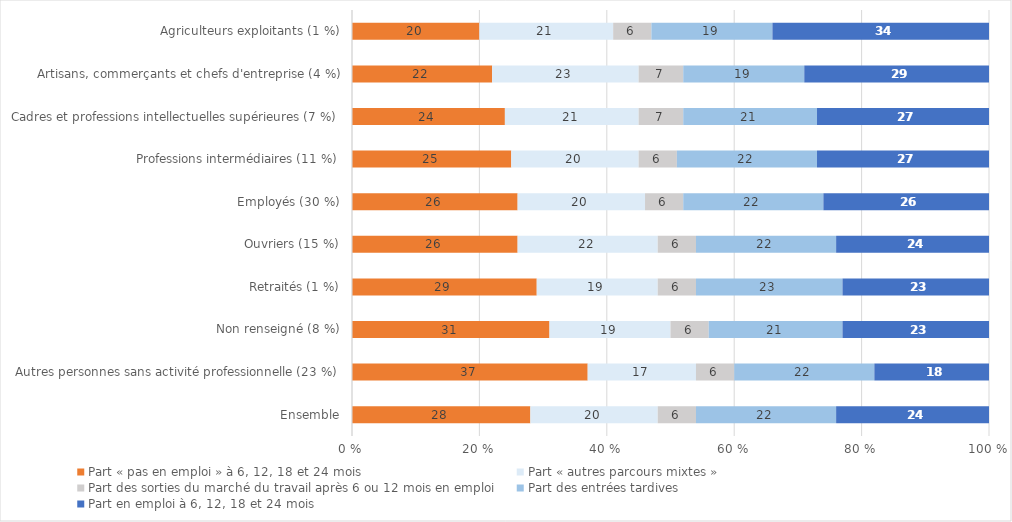
| Category | Part « pas en emploi » à 6, 12, 18 et 24 mois | Part « autres parcours mixtes » | Part des sorties du marché du travail après 6 ou 12 mois en emploi | Part des entrées tardives | Part en emploi à 6, 12, 18 et 24 mois |
|---|---|---|---|---|---|
| Ensemble | 28 | 20 | 6 | 22 | 24 |
| Autres personnes sans activité professionnelle (23 %) | 37 | 17 | 6 | 22 | 18 |
| Non renseigné (8 %) | 31 | 19 | 6 | 21 | 23 |
| Retraités (1 %) | 29 | 19 | 6 | 23 | 23 |
| Ouvriers (15 %) | 26 | 22 | 6 | 22 | 24 |
| Employés (30 %) | 26 | 20 | 6 | 22 | 26 |
| Professions intermédiaires (11 %) | 25 | 20 | 6 | 22 | 27 |
| Cadres et professions intellectuelles supérieures (7 %) | 24 | 21 | 7 | 21 | 27 |
| Artisans, commerçants et chefs d'entreprise (4 %) | 22 | 23 | 7 | 19 | 29 |
| Agriculteurs exploitants (1 %) | 20 | 21 | 6 | 19 | 34 |